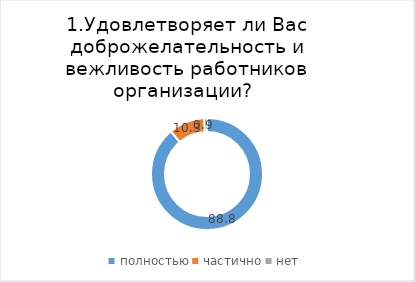
| Category | Чаинский |
|---|---|
| полностью | 88.793 |
| частично | 10.345 |
| нет | 0.862 |